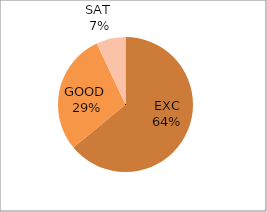
| Category | Series 1 | Series 0 |
|---|---|---|
| EXC | 64 | 46 |
| GOOD  | 29 | 46 |
| SAT  | 7 | 8 |